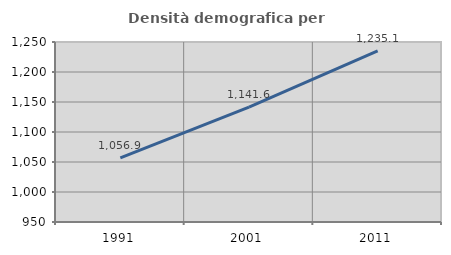
| Category | Densità demografica |
|---|---|
| 1991.0 | 1056.858 |
| 2001.0 | 1141.577 |
| 2011.0 | 1235.116 |